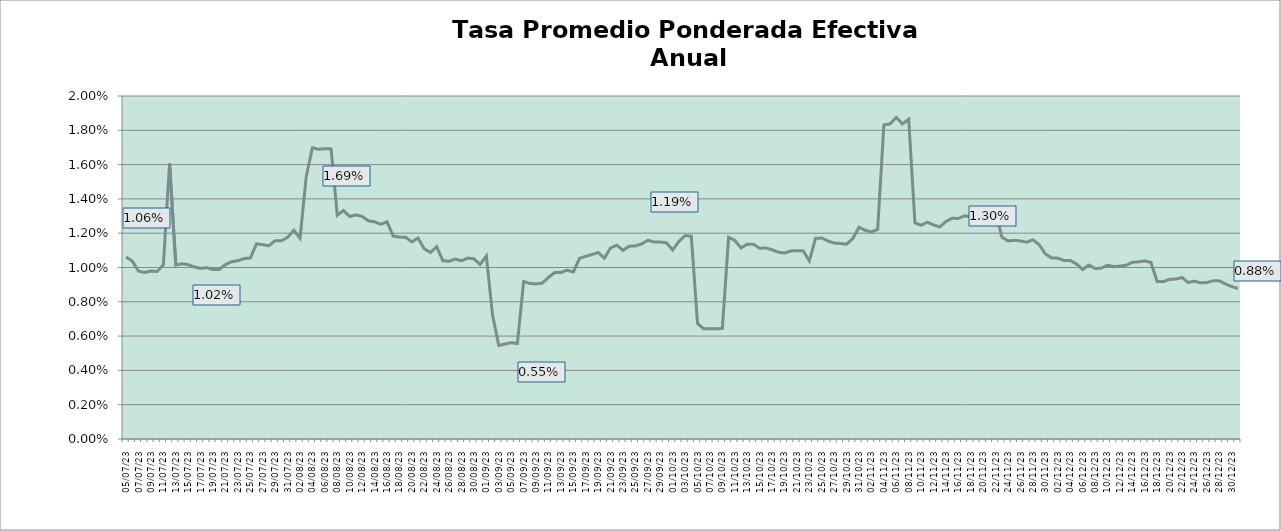
| Category | TEA |
|---|---|
| 2023-07-05 | 0.011 |
| 2023-07-06 | 0.01 |
| 2023-07-07 | 0.01 |
| 2023-07-08 | 0.01 |
| 2023-07-09 | 0.01 |
| 2023-07-10 | 0.01 |
| 2023-07-11 | 0.01 |
| 2023-07-12 | 0.016 |
| 2023-07-13 | 0.01 |
| 2023-07-14 | 0.01 |
| 2023-07-15 | 0.01 |
| 2023-07-16 | 0.01 |
| 2023-07-17 | 0.01 |
| 2023-07-18 | 0.01 |
| 2023-07-19 | 0.01 |
| 2023-07-20 | 0.01 |
| 2023-07-21 | 0.01 |
| 2023-07-22 | 0.01 |
| 2023-07-23 | 0.01 |
| 2023-07-24 | 0.011 |
| 2023-07-25 | 0.011 |
| 2023-07-26 | 0.011 |
| 2023-07-27 | 0.011 |
| 2023-07-28 | 0.011 |
| 2023-07-29 | 0.012 |
| 2023-07-30 | 0.012 |
| 2023-07-31 | 0.012 |
| 2023-08-01 | 0.012 |
| 2023-08-02 | 0.012 |
| 2023-08-03 | 0.015 |
| 2023-08-04 | 0.017 |
| 2023-08-05 | 0.017 |
| 2023-08-06 | 0.017 |
| 2023-08-07 | 0.017 |
| 2023-08-08 | 0.013 |
| 2023-08-09 | 0.013 |
| 2023-08-10 | 0.013 |
| 2023-08-11 | 0.013 |
| 2023-08-12 | 0.013 |
| 2023-08-13 | 0.013 |
| 2023-08-14 | 0.013 |
| 2023-08-15 | 0.013 |
| 2023-08-16 | 0.013 |
| 2023-08-17 | 0.012 |
| 2023-08-18 | 0.012 |
| 2023-08-19 | 0.012 |
| 2023-08-20 | 0.011 |
| 2023-08-21 | 0.012 |
| 2023-08-22 | 0.011 |
| 2023-08-23 | 0.011 |
| 2023-08-24 | 0.011 |
| 2023-08-25 | 0.01 |
| 2023-08-26 | 0.01 |
| 2023-08-27 | 0.01 |
| 2023-08-28 | 0.01 |
| 2023-08-29 | 0.011 |
| 2023-08-30 | 0.011 |
| 2023-08-31 | 0.01 |
| 2023-09-01 | 0.011 |
| 2023-09-02 | 0.007 |
| 2023-09-03 | 0.005 |
| 2023-09-04 | 0.006 |
| 2023-09-05 | 0.006 |
| 2023-09-06 | 0.006 |
| 2023-09-07 | 0.009 |
| 2023-09-08 | 0.009 |
| 2023-09-09 | 0.009 |
| 2023-09-10 | 0.009 |
| 2023-09-11 | 0.009 |
| 2023-09-12 | 0.01 |
| 2023-09-13 | 0.01 |
| 2023-09-14 | 0.01 |
| 2023-09-15 | 0.01 |
| 2023-09-16 | 0.011 |
| 2023-09-17 | 0.011 |
| 2023-09-18 | 0.011 |
| 2023-09-19 | 0.011 |
| 2023-09-20 | 0.011 |
| 2023-09-21 | 0.011 |
| 2023-09-22 | 0.011 |
| 2023-09-23 | 0.011 |
| 2023-09-24 | 0.011 |
| 2023-09-25 | 0.011 |
| 2023-09-26 | 0.011 |
| 2023-09-27 | 0.012 |
| 2023-09-28 | 0.011 |
| 2023-09-29 | 0.011 |
| 2023-09-30 | 0.011 |
| 2023-10-01 | 0.011 |
| 2023-10-02 | 0.012 |
| 2023-10-03 | 0.012 |
| 2023-10-04 | 0.012 |
| 2023-10-05 | 0.007 |
| 2023-10-06 | 0.006 |
| 2023-10-07 | 0.006 |
| 2023-10-08 | 0.006 |
| 2023-10-09 | 0.006 |
| 2023-10-10 | 0.012 |
| 2023-10-11 | 0.012 |
| 2023-10-12 | 0.011 |
| 2023-10-13 | 0.011 |
| 2023-10-14 | 0.011 |
| 2023-10-15 | 0.011 |
| 2023-10-16 | 0.011 |
| 2023-10-17 | 0.011 |
| 2023-10-18 | 0.011 |
| 2023-10-19 | 0.011 |
| 2023-10-20 | 0.011 |
| 2023-10-21 | 0.011 |
| 2023-10-22 | 0.011 |
| 2023-10-23 | 0.01 |
| 2023-10-24 | 0.012 |
| 2023-10-25 | 0.012 |
| 2023-10-26 | 0.012 |
| 2023-10-27 | 0.011 |
| 2023-10-28 | 0.011 |
| 2023-10-29 | 0.011 |
| 2023-10-30 | 0.012 |
| 2023-10-31 | 0.012 |
| 2023-11-01 | 0.012 |
| 2023-11-02 | 0.012 |
| 2023-11-03 | 0.012 |
| 2023-11-04 | 0.018 |
| 2023-11-05 | 0.018 |
| 2023-11-06 | 0.019 |
| 2023-11-07 | 0.018 |
| 2023-11-08 | 0.019 |
| 2023-11-09 | 0.013 |
| 2023-11-10 | 0.012 |
| 2023-11-11 | 0.013 |
| 2023-11-12 | 0.012 |
| 2023-11-13 | 0.012 |
| 2023-11-14 | 0.013 |
| 2023-11-15 | 0.013 |
| 2023-11-16 | 0.013 |
| 2023-11-17 | 0.013 |
| 2023-11-18 | 0.013 |
| 2023-11-19 | 0.013 |
| 2023-11-20 | 0.013 |
| 2023-11-21 | 0.013 |
| 2023-11-22 | 0.013 |
| 2023-11-23 | 0.012 |
| 2023-11-24 | 0.012 |
| 2023-11-25 | 0.012 |
| 2023-11-26 | 0.012 |
| 2023-11-27 | 0.011 |
| 2023-11-28 | 0.012 |
| 2023-11-29 | 0.011 |
| 2023-11-30 | 0.011 |
| 2023-12-01 | 0.011 |
| 2023-12-02 | 0.011 |
| 2023-12-03 | 0.01 |
| 2023-12-04 | 0.01 |
| 2023-12-05 | 0.01 |
| 2023-12-06 | 0.01 |
| 2023-12-07 | 0.01 |
| 2023-12-08 | 0.01 |
| 2023-12-09 | 0.01 |
| 2023-12-10 | 0.01 |
| 2023-12-11 | 0.01 |
| 2023-12-12 | 0.01 |
| 2023-12-13 | 0.01 |
| 2023-12-14 | 0.01 |
| 2023-12-15 | 0.01 |
| 2023-12-16 | 0.01 |
| 2023-12-17 | 0.01 |
| 2023-12-18 | 0.009 |
| 2023-12-19 | 0.009 |
| 2023-12-20 | 0.009 |
| 2023-12-21 | 0.009 |
| 2023-12-22 | 0.009 |
| 2023-12-23 | 0.009 |
| 2023-12-24 | 0.009 |
| 2023-12-25 | 0.009 |
| 2023-12-26 | 0.009 |
| 2023-12-27 | 0.009 |
| 2023-12-28 | 0.009 |
| 2023-12-29 | 0.009 |
| 2023-12-30 | 0.009 |
| 2023-12-31 | 0.009 |